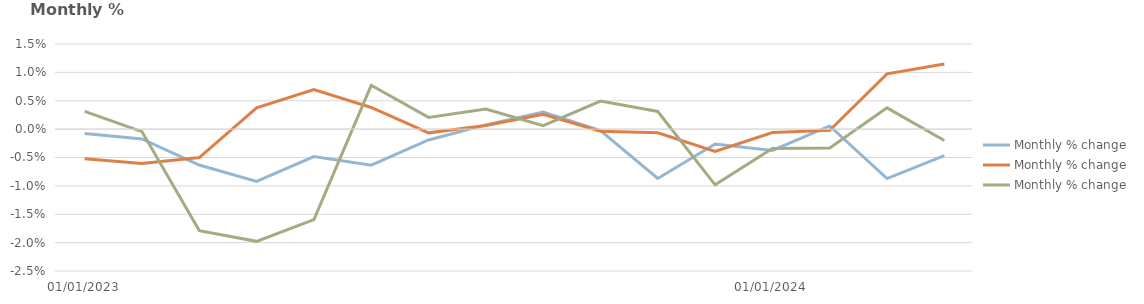
| Category | England | Scotland | Wales |
|---|---|---|---|
| 01/01/2023 | -0.001 | -0.005 | 0.003 |
| 01/02/2023 | -0.002 | -0.006 | 0 |
| 01/03/2023 | -0.006 | -0.005 | -0.018 |
| 01/04/2023 | -0.009 | 0.004 | -0.02 |
| 01/05/2023 | -0.005 | 0.007 | -0.016 |
| 01/06/2023 | -0.006 | 0.004 | 0.008 |
| 01/07/2023 | -0.002 | -0.001 | 0.002 |
| 01/08/2023 | 0.001 | 0.001 | 0.004 |
| 01/09/2023 | 0.003 | 0.003 | 0.001 |
| 01/10/2023 | 0 | 0 | 0.005 |
| 01/11/2023 | -0.009 | -0.001 | 0.003 |
| 01/12/2023 | -0.003 | -0.004 | -0.01 |
| 01/01/2024 | -0.004 | -0.001 | -0.003 |
| 01/02/2024 | 0.001 | 0 | -0.003 |
| 01/03/2024 | -0.009 | 0.01 | 0.004 |
| 01/04/2024 | -0.005 | 0.011 | -0.002 |